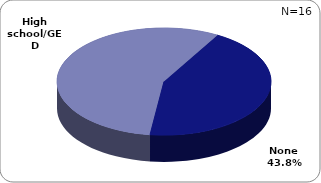
| Category | Series 0 |
|---|---|
| None | 0.438 |
| High school/GED | 0.562 |